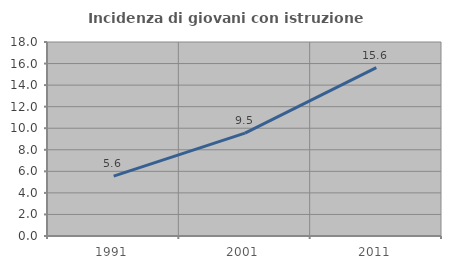
| Category | Incidenza di giovani con istruzione universitaria |
|---|---|
| 1991.0 | 5.556 |
| 2001.0 | 9.541 |
| 2011.0 | 15.625 |